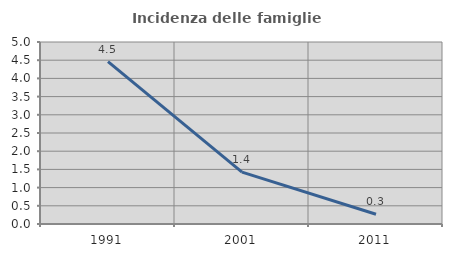
| Category | Incidenza delle famiglie numerose |
|---|---|
| 1991.0 | 4.461 |
| 2001.0 | 1.426 |
| 2011.0 | 0.268 |